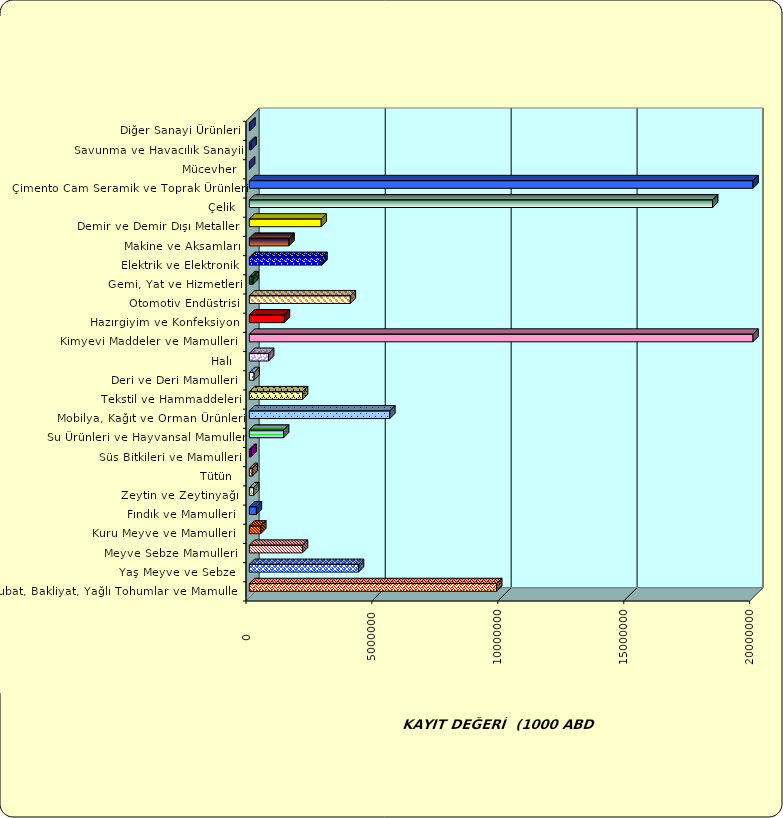
| Category | Series 0 |
|---|---|
|  Hububat, Bakliyat, Yağlı Tohumlar ve Mamulleri  | 9821575.144 |
|  Yaş Meyve ve Sebze   | 4334293.432 |
|  Meyve Sebze Mamulleri  | 2108599.233 |
|  Kuru Meyve ve Mamulleri   | 454350.994 |
|  Fındık ve Mamulleri  | 278810.384 |
|  Zeytin ve Zeytinyağı  | 171369.454 |
|  Tütün  | 114922.399 |
|  Süs Bitkileri ve Mamulleri | 67610.678 |
|  Su Ürünleri ve Hayvansal Mamuller | 1360275.564 |
|  Mobilya, Kağıt ve Orman Ürünleri | 5577999.74 |
|  Tekstil ve Hammaddeleri | 2112279.345 |
|  Deri ve Deri Mamulleri  | 187333.744 |
|  Halı  | 765279.032 |
|  Kimyevi Maddeler ve Mamulleri   | 26324581.822 |
|  Hazırgiyim ve Konfeksiyon  | 1392112.664 |
|  Otomotiv Endüstrisi | 4009390.54 |
|  Gemi, Yat ve Hizmetleri | 150645.127 |
|  Elektrik ve Elektronik | 2884241.026 |
|  Makine ve Aksamları | 1575132.593 |
|  Demir ve Demir Dışı Metaller  | 2854076.381 |
|  Çelik | 18397389.431 |
|  Çimento Cam Seramik ve Toprak Ürünleri | 34237117.026 |
|  Mücevher | 8936.524 |
|  Savunma ve Havacılık Sanayii | 67420.522 |
|  Diğer Sanayi Ürünleri | 21882.717 |